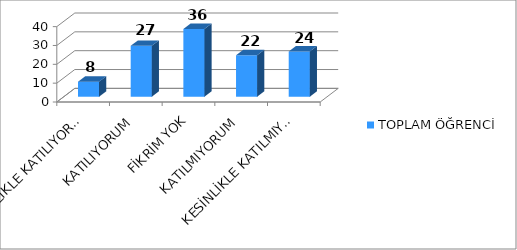
| Category | TOPLAM ÖĞRENCİ |
|---|---|
| KESİNLİKLE KATILIYORUM | 8 |
| KATILIYORUM | 27 |
| FİKRİM YOK | 36 |
| KATILMIYORUM | 22 |
| KESİNLİKLE KATILMIYORUM | 24 |